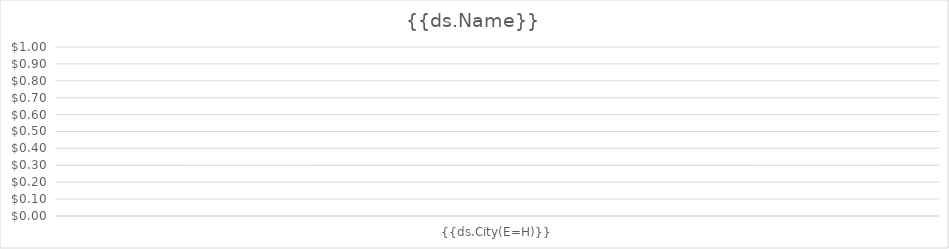
| Category | {{ds.Name}} |
|---|---|
| {{ds.City(E=H)}} | 0 |